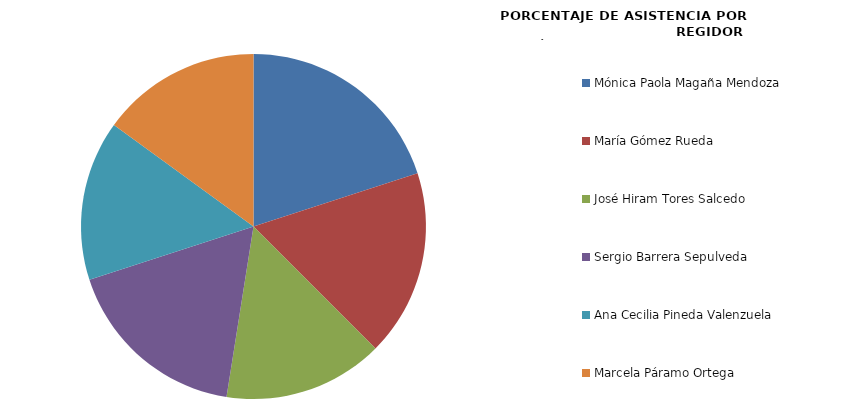
| Category | Series 0 |
|---|---|
| Mónica Paola Magaña Mendoza | 100 |
| María Gómez Rueda | 87.5 |
| José Hiram Tores Salcedo | 75 |
| Sergio Barrera Sepulveda | 87.5 |
| Ana Cecilia Pineda Valenzuela | 75 |
| Marcela Páramo Ortega | 75 |